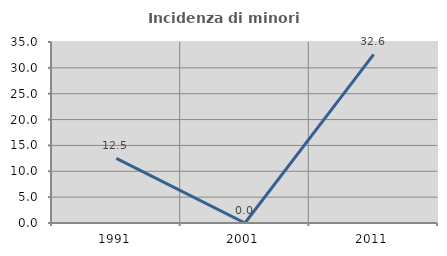
| Category | Incidenza di minori stranieri |
|---|---|
| 1991.0 | 12.5 |
| 2001.0 | 0 |
| 2011.0 | 32.609 |